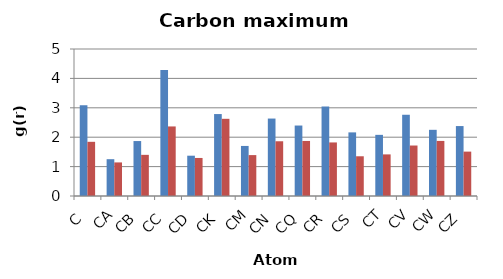
| Category | OW | HW |
|---|---|---|
| C | 3.089 | 1.843 |
| CA | 1.252 | 1.142 |
| CB | 1.869 | 1.4 |
| CC | 4.285 | 2.366 |
| CD | 1.371 | 1.294 |
| CK | 2.787 | 2.626 |
| CM | 1.703 | 1.391 |
| CN | 2.634 | 1.862 |
| CQ | 2.397 | 1.872 |
| CR | 3.046 | 1.822 |
| CS | 2.164 | 1.351 |
| CT | 2.08 | 1.415 |
| CV | 2.763 | 1.717 |
| CW | 2.251 | 1.873 |
| CZ | 2.379 | 1.51 |